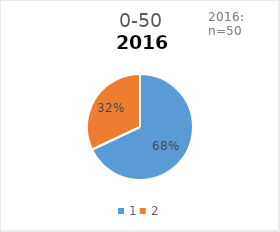
| Category | 0-50 |
|---|---|
| 0 | 0.68 |
| 1 | 0.32 |